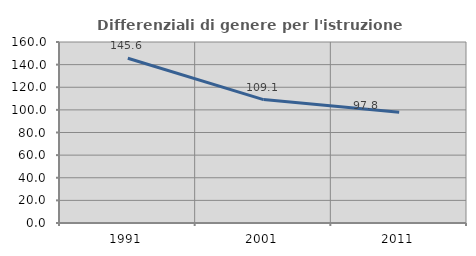
| Category | Differenziali di genere per l'istruzione superiore |
|---|---|
| 1991.0 | 145.588 |
| 2001.0 | 109.1 |
| 2011.0 | 97.822 |